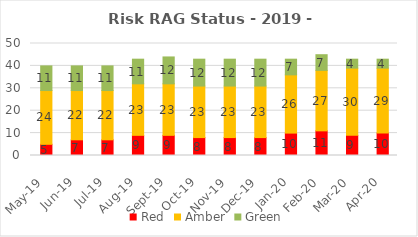
| Category | Red | Amber | Green |
|---|---|---|---|
| 2019-05-01 | 5 | 24 | 11 |
| 2019-06-01 | 7 | 22 | 11 |
| 2019-07-01 | 7 | 22 | 11 |
| 2019-08-01 | 9 | 23 | 11 |
| 2019-09-01 | 9 | 23 | 12 |
| 2019-10-01 | 8 | 23 | 12 |
| 2019-11-01 | 8 | 23 | 12 |
| 2019-12-01 | 8 | 23 | 12 |
| 2020-01-01 | 10 | 26 | 7 |
| 2020-02-01 | 11 | 27 | 7 |
| 2020-03-01 | 9 | 30 | 4 |
| 2020-04-01 | 10 | 29 | 4 |